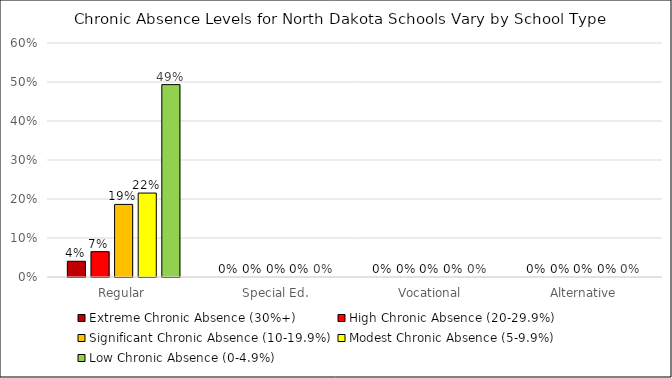
| Category | Extreme Chronic Absence (30%+) | High Chronic Absence (20-29.9%) | Significant Chronic Absence (10-19.9%) | Modest Chronic Absence (5-9.9%) | Low Chronic Absence (0-4.9%) |
|---|---|---|---|---|---|
| Regular | 0.04 | 0.065 | 0.186 | 0.215 | 0.493 |
| Special Ed. | 0 | 0 | 0 | 0 | 0 |
| Vocational | 0 | 0 | 0 | 0 | 0 |
| Alternative | 0 | 0 | 0 | 0 | 0 |